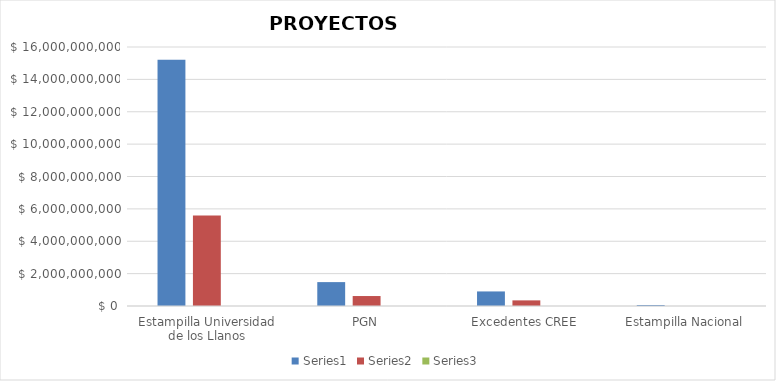
| Category | Series 0 | Series 1 | Series 2 |
|---|---|---|---|
| Estampilla Universidad de los Llanos | 15210171890 | 5596789957 | 0.368 |
| PGN | 1476000000 | 615908889 | 0.417 |
| Excedentes CREE | 899689263 | 347633639 | 0.386 |
| Estampilla Nacional | 61156806 | 0 | 0 |